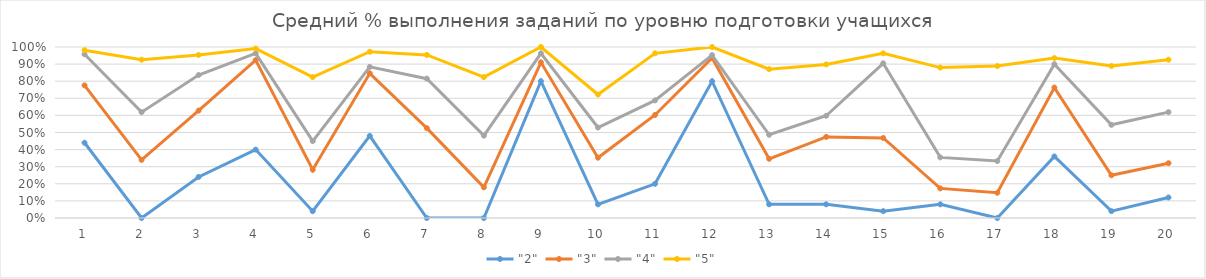
| Category | "2" | "3" | "4" | "5" |
|---|---|---|---|---|
| 0 | 0.44 | 0.776 | 0.958 | 0.981 |
| 1 | 0 | 0.34 | 0.619 | 0.926 |
| 2 | 0.24 | 0.628 | 0.836 | 0.954 |
| 3 | 0.4 | 0.923 | 0.963 | 0.991 |
| 4 | 0.04 | 0.282 | 0.45 | 0.824 |
| 5 | 0.48 | 0.846 | 0.884 | 0.972 |
| 6 | 0 | 0.526 | 0.815 | 0.954 |
| 7 | 0 | 0.179 | 0.481 | 0.824 |
| 8 | 0.8 | 0.91 | 0.963 | 1 |
| 9 | 0.08 | 0.353 | 0.529 | 0.722 |
| 10 | 0.2 | 0.603 | 0.688 | 0.963 |
| 11 | 0.8 | 0.936 | 0.952 | 1 |
| 12 | 0.08 | 0.346 | 0.487 | 0.87 |
| 13 | 0.08 | 0.474 | 0.598 | 0.898 |
| 14 | 0.04 | 0.468 | 0.905 | 0.963 |
| 15 | 0.08 | 0.173 | 0.354 | 0.88 |
| 16 | 0 | 0.147 | 0.333 | 0.889 |
| 17 | 0.36 | 0.763 | 0.899 | 0.935 |
| 18 | 0.04 | 0.25 | 0.545 | 0.889 |
| 19 | 0.12 | 0.321 | 0.619 | 0.926 |